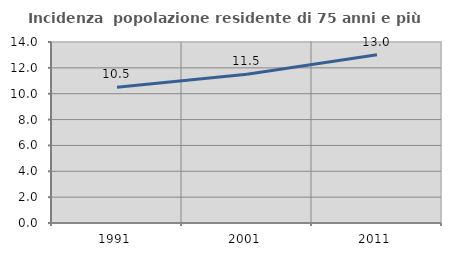
| Category | Incidenza  popolazione residente di 75 anni e più |
|---|---|
| 1991.0 | 10.497 |
| 2001.0 | 11.511 |
| 2011.0 | 13.015 |